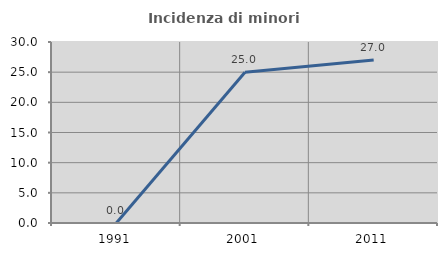
| Category | Incidenza di minori stranieri |
|---|---|
| 1991.0 | 0 |
| 2001.0 | 25 |
| 2011.0 | 27.027 |